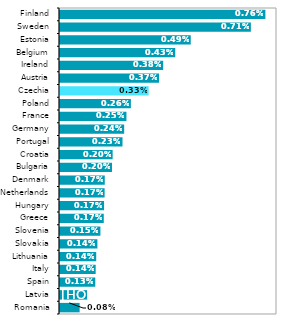
| Category | Series 0 |
|---|---|
| Romania | 0.001 |
| Latvia | 0.001 |
| Spain | 0.001 |
| Italy | 0.001 |
| Lithuania | 0.001 |
| Slovakia | 0.001 |
| Slovenia | 0.002 |
| Greece | 0.002 |
| Hungary | 0.002 |
| Netherlands | 0.002 |
| Denmark | 0.002 |
| Bulgaria | 0.002 |
| Croatia | 0.002 |
| Portugal | 0.002 |
| Germany | 0.002 |
| France | 0.002 |
| Poland | 0.003 |
| Czechia | 0.003 |
| Austria | 0.004 |
| Ireland | 0.004 |
| Belgium | 0.004 |
| Estonia | 0.005 |
| Sweden | 0.007 |
| Finland | 0.008 |